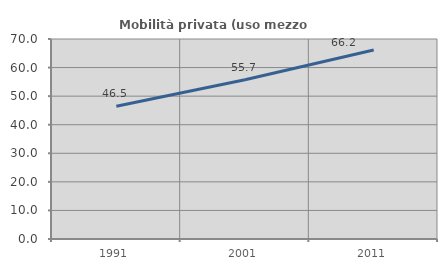
| Category | Mobilità privata (uso mezzo privato) |
|---|---|
| 1991.0 | 46.492 |
| 2001.0 | 55.747 |
| 2011.0 | 66.158 |